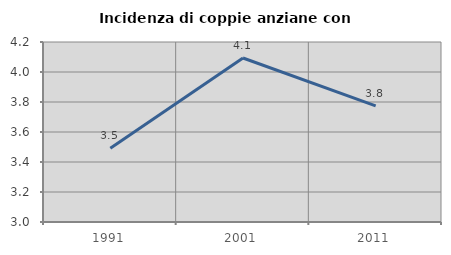
| Category | Incidenza di coppie anziane con figli |
|---|---|
| 1991.0 | 3.492 |
| 2001.0 | 4.094 |
| 2011.0 | 3.774 |